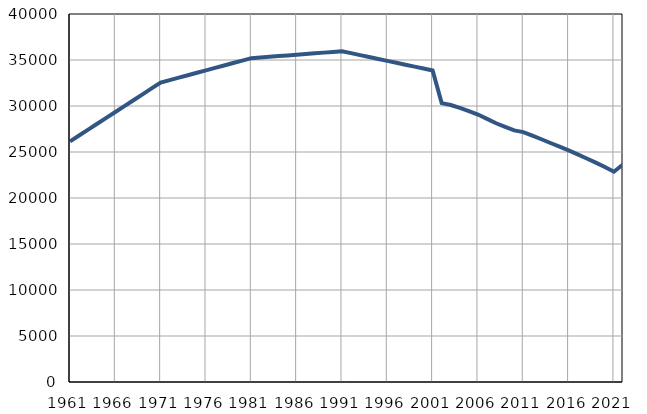
| Category | Број
становника |
|---|---|
| 1961.0 | 26147 |
| 1962.0 | 26788 |
| 1963.0 | 27427 |
| 1964.0 | 28067 |
| 1965.0 | 28707 |
| 1966.0 | 29348 |
| 1967.0 | 29988 |
| 1968.0 | 30628 |
| 1969.0 | 31268 |
| 1970.0 | 31908 |
| 1971.0 | 32548 |
| 1972.0 | 32813 |
| 1973.0 | 33078 |
| 1974.0 | 33344 |
| 1975.0 | 33609 |
| 1976.0 | 33874 |
| 1977.0 | 34139 |
| 1978.0 | 34404 |
| 1979.0 | 34670 |
| 1980.0 | 34935 |
| 1981.0 | 35200 |
| 1982.0 | 35275 |
| 1983.0 | 35350 |
| 1984.0 | 35425 |
| 1985.0 | 35500 |
| 1986.0 | 35575 |
| 1987.0 | 35651 |
| 1988.0 | 35725 |
| 1989.0 | 35801 |
| 1990.0 | 35876 |
| 1991.0 | 35951 |
| 1992.0 | 35743 |
| 1993.0 | 35534 |
| 1994.0 | 35326 |
| 1995.0 | 35117 |
| 1996.0 | 34908 |
| 1997.0 | 34701 |
| 1998.0 | 34492 |
| 1999.0 | 34283 |
| 2000.0 | 34075 |
| 2001.0 | 33866 |
| 2002.0 | 30313 |
| 2003.0 | 30104 |
| 2004.0 | 29793 |
| 2005.0 | 29447 |
| 2006.0 | 29070 |
| 2007.0 | 28603 |
| 2008.0 | 28122 |
| 2009.0 | 27730 |
| 2010.0 | 27349 |
| 2011.0 | 27166 |
| 2012.0 | 26770 |
| 2013.0 | 26386 |
| 2014.0 | 25979 |
| 2015.0 | 25583 |
| 2016.0 | 25171 |
| 2017.0 | 24745 |
| 2018.0 | 24299 |
| 2019.0 | 23847 |
| 2020.0 | 23373 |
| 2021.0 | 22857 |
| 2022.0 | 23647 |